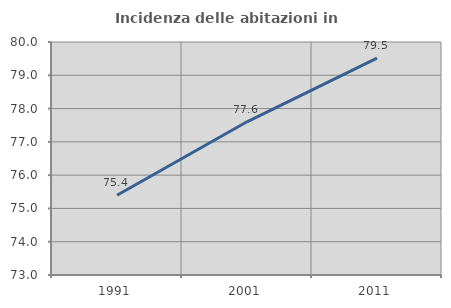
| Category | Incidenza delle abitazioni in proprietà  |
|---|---|
| 1991.0 | 75.397 |
| 2001.0 | 77.603 |
| 2011.0 | 79.517 |